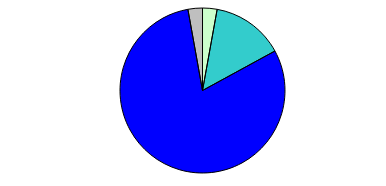
| Category | Series 0 |
|---|---|
| 0 | 0 |
| 1 | 0 |
| 2 | 5 |
| 3 | 25 |
| 4 | 141 |
| 5 | 5 |